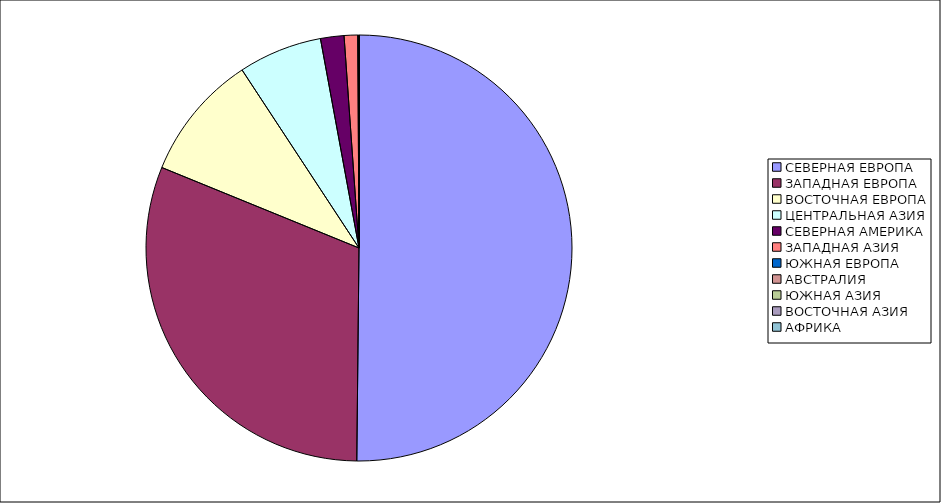
| Category | Оборот |
|---|---|
| СЕВЕРНАЯ ЕВРОПА | 50.16 |
| ЗАПАДНАЯ ЕВРОПА | 31 |
| ВОСТОЧНАЯ ЕВРОПА | 9.58 |
| ЦЕНТРАЛЬНАЯ АЗИЯ | 6.35 |
| СЕВЕРНАЯ АМЕРИКА | 1.78 |
| ЗАПАДНАЯ АЗИЯ | 1.03 |
| ЮЖНАЯ ЕВРОПА | 0.04 |
| АВСТРАЛИЯ | 0.03 |
| ЮЖНАЯ АЗИЯ | 0.02 |
| ВОСТОЧНАЯ АЗИЯ | 0 |
| АФРИКА | 0 |